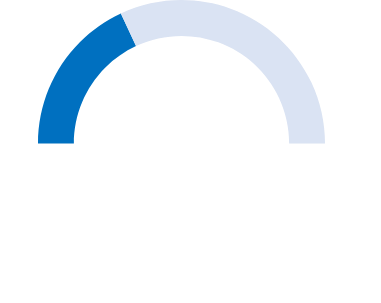
| Category | Series 0 |
|---|---|
| 0 | 0.361 |
| 1 | 0.639 |
| 2 | 1 |